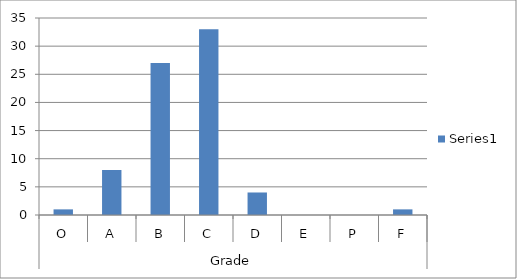
| Category | Series 0 |
|---|---|
| 0 | 1 |
| 1 | 8 |
| 2 | 27 |
| 3 | 33 |
| 4 | 4 |
| 5 | 0 |
| 6 | 0 |
| 7 | 1 |